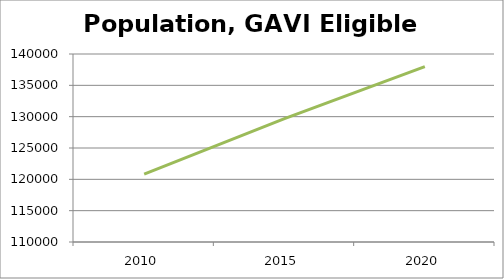
| Category | Population |
|---|---|
| 2010.0 | 120822 |
| 2015.0 | 129676 |
| 2020.0 | 138000 |